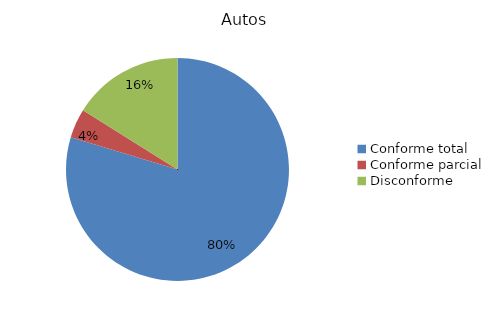
| Category | Autos |
|---|---|
| Conforme total | 94 |
| Conforme parcial | 5 |
| Disconforme | 19 |